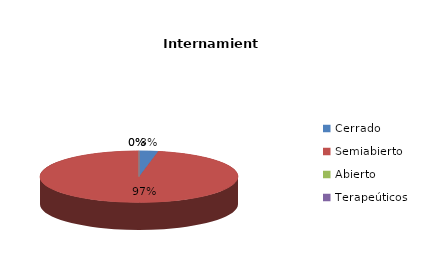
| Category | Series 0 |
|---|---|
| Cerrado | 2 |
| Semiabierto | 63 |
| Abierto | 0 |
| Terapeúticos | 0 |